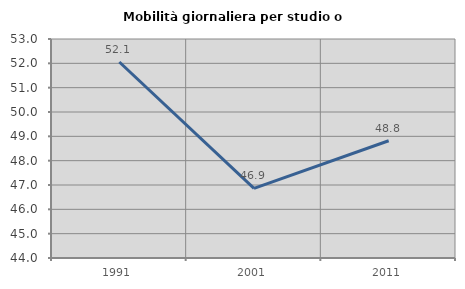
| Category | Mobilità giornaliera per studio o lavoro |
|---|---|
| 1991.0 | 52.055 |
| 2001.0 | 46.863 |
| 2011.0 | 48.819 |